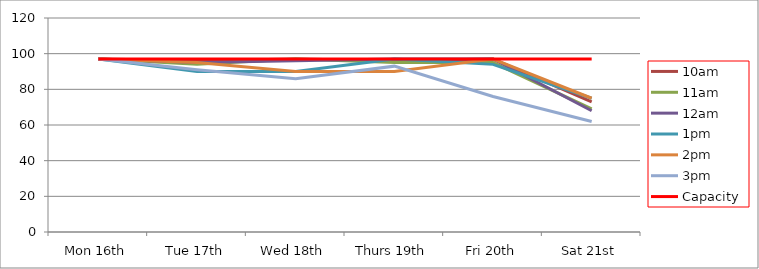
| Category | 9am | 10am | 11am | 12am | 1pm | 2pm | 3pm | 4pm | 5pm | Capacity |
|---|---|---|---|---|---|---|---|---|---|---|
| Mon 16th |  | 97 | 97 | 97 | 97 | 97 | 97 |  |  | 97 |
| Tue 17th |  | 96 | 94 | 95 | 90 | 95 | 91 |  |  | 97 |
| Wed 18th |  | 97 | 97 | 96 | 90 | 90 | 86 |  |  | 97 |
| Thurs 19th |  | 96 | 95 | 97 | 97 | 90 | 93 |  |  | 97 |
| Fri 20th |  | 97 | 95 | 97 | 94 | 97 | 76 |  |  | 97 |
| Sat 21st |  | 73 | 69 | 68 | 75 | 75 | 62 |  |  | 97 |